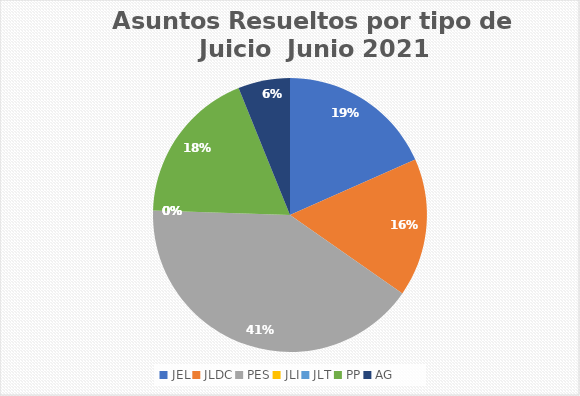
| Category | Asuntos Resueltos por tipo de Juicio  Junio |
|---|---|
| JEL | 9 |
| JLDC | 8 |
| PES | 20 |
| JLI | 0 |
| JLT | 0 |
| PP | 9 |
| AG | 3 |